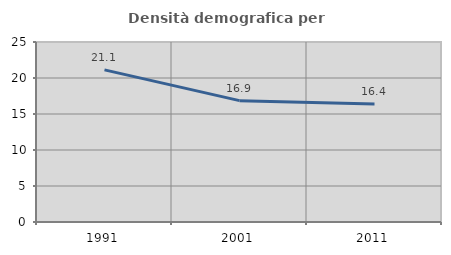
| Category | Densità demografica |
|---|---|
| 1991.0 | 21.124 |
| 2001.0 | 16.853 |
| 2011.0 | 16.391 |